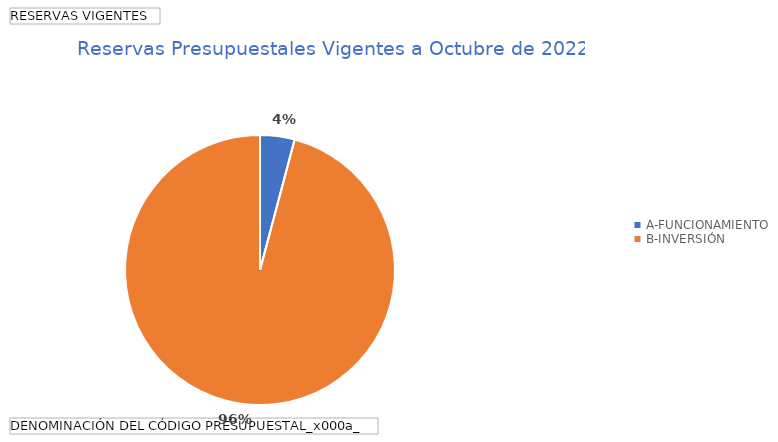
| Category | Total |
|---|---|
| A-FUNCIONAMIENTO | 2249.649 |
| B-INVERSIÓN | 52189.047 |